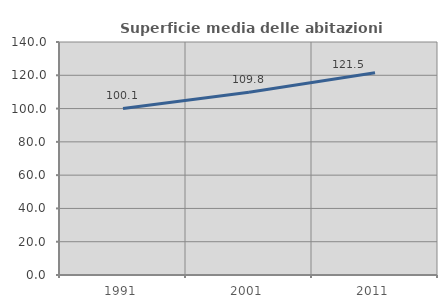
| Category | Superficie media delle abitazioni occupate |
|---|---|
| 1991.0 | 100.084 |
| 2001.0 | 109.775 |
| 2011.0 | 121.495 |